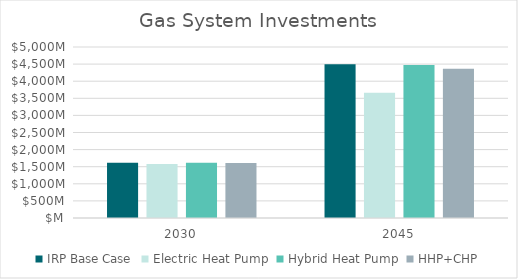
| Category |  IRP Base Case  |  Electric Heat Pump  |  Hybrid Heat Pump  |  HHP+CHP  |
|---|---|---|---|---|
| 2030.0 | 1614009881.998 | 1576372842.909 | 1613334042.783 | 1608589627.959 |
| 2045.0 | 4496236140.559 | 3664914438.859 | 4474191132.875 | 4361395088.426 |